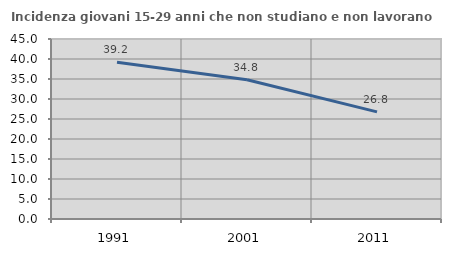
| Category | Incidenza giovani 15-29 anni che non studiano e non lavorano  |
|---|---|
| 1991.0 | 39.189 |
| 2001.0 | 34.802 |
| 2011.0 | 26.776 |